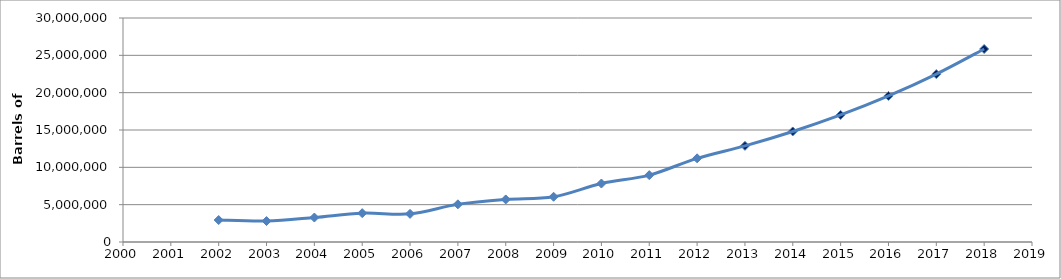
| Category | Series 0 |
|---|---|
| 2002.0 | 2940738 |
| 2003.0 | 2805745 |
| 2004.0 | 3276753 |
| 2005.0 | 3862726 |
| 2006.0 | 3768506 |
| 2007.0 | 5043578 |
| 2008.0 | 5699654 |
| 2009.0 | 6057583 |
| 2010.0 | 7830758 |
| 2011.0 | 8955798 |
| 2012.0 | 11204120 |
| 2013.0 | 12879212.746 |
| 2014.0 | 14804743.341 |
| 2015.0 | 17018153.96 |
| 2016.0 | 19562484.639 |
| 2017.0 | 22487210.197 |
| 2018.0 | 25849202.276 |